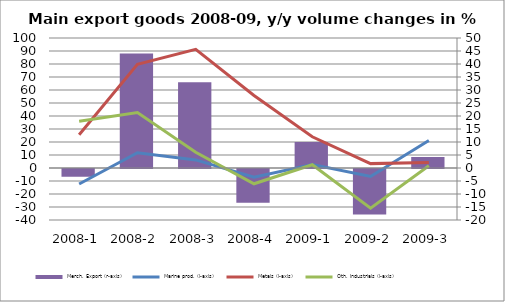
| Category | Merch. Export (r-axis) |
|---|---|
| 2008-1 | -3 |
| 2008-2 | 44 |
| 2008-3 | 33 |
| 2008-4 | -13 |
| 2009-1 | 10 |
| 2009-2 | -17.5 |
| 2009-3 | 4.2 |